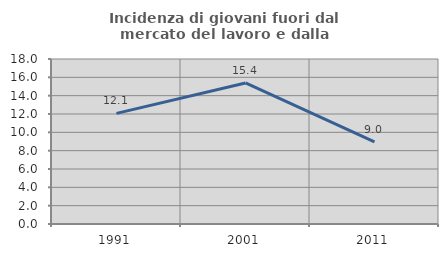
| Category | Incidenza di giovani fuori dal mercato del lavoro e dalla formazione  |
|---|---|
| 1991.0 | 12.069 |
| 2001.0 | 15.385 |
| 2011.0 | 8.955 |